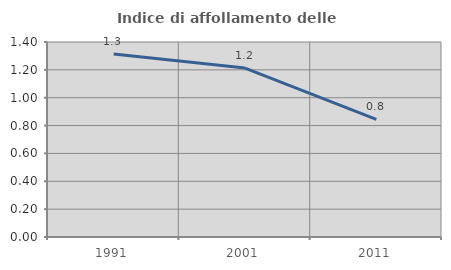
| Category | Indice di affollamento delle abitazioni  |
|---|---|
| 1991.0 | 1.313 |
| 2001.0 | 1.213 |
| 2011.0 | 0.844 |